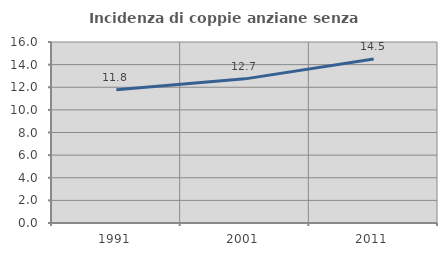
| Category | Incidenza di coppie anziane senza figli  |
|---|---|
| 1991.0 | 11.781 |
| 2001.0 | 12.742 |
| 2011.0 | 14.505 |